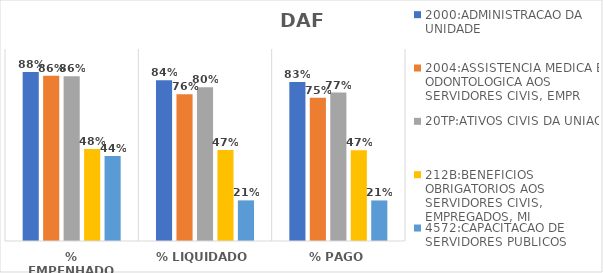
| Category | 2000:ADMINISTRACAO DA UNIDADE | 2004:ASSISTENCIA MEDICA E ODONTOLOGICA AOS SERVIDORES CIVIS, EMPR | 20TP:ATIVOS CIVIS DA UNIAO | 212B:BENEFICIOS OBRIGATORIOS AOS SERVIDORES CIVIS, EMPREGADOS, MI | 4572:CAPACITACAO DE SERVIDORES PUBLICOS FEDERAIS EM PROCESSO DE Q |
|---|---|---|---|---|---|
| % EMPENHADO | 0.88 | 0.861 | 0.859 | 0.479 | 0.443 |
| % LIQUIDADO | 0.837 | 0.765 | 0.8 | 0.474 | 0.212 |
| % PAGO | 0.828 | 0.746 | 0.773 | 0.473 | 0.211 |